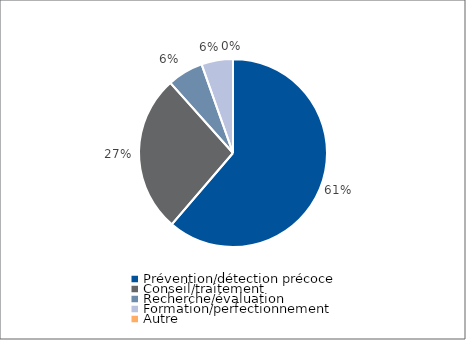
| Category | Series 0 |
|---|---|
| Prévention/détection précoce | 110804.8 |
| Conseil/traitement | 49000 |
| Recherche/évaluation | 11200 |
| Formation/perfectionnement | 9800 |
| Autre | 0 |